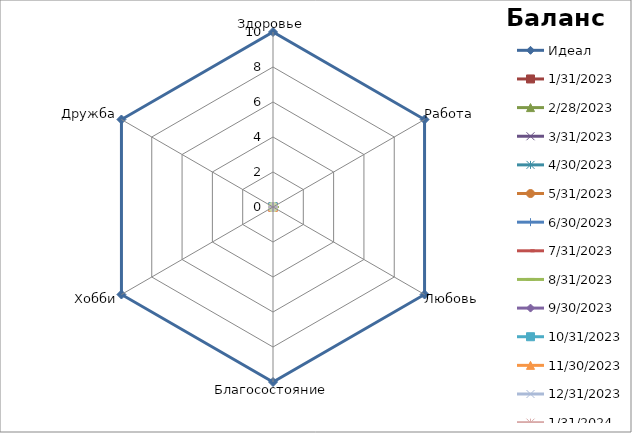
| Category | Идеал | 31.01.2023 | 28.02.2023 | 31.03.2023 | 30.04.2023 | 31.05.2023 | 30.06.2023 | 31.07.2023 | 31.08.2023 | 30.09.2023 | 31.10.2023 | 30.11.2023 | 31.12.2023 | 31.01.2024 | 29.02.2024 | 31.03.2024 |
|---|---|---|---|---|---|---|---|---|---|---|---|---|---|---|---|---|
| Здоровье | 10 | 0 | 0 | 0 | 0 | 0 | 0 | 0 | 0 | 0 | 0 | 0 | 0 | 0 | 0 | 0 |
| Работа | 10 | 0 | 0 | 0 | 0 | 0 | 0 | 0 | 0 | 0 | 0 | 0 | 0 | 0 | 0 | 0 |
| Любовь | 10 | 0 | 0 | 0 | 0 | 0 | 0 | 0 | 0 | 0 | 0 | 0 | 0 | 0 | 0 | 0 |
| Благосостояние | 10 | 0 | 0 | 0 | 0 | 0 | 0 | 0 | 0 | 0 | 0 | 0 | 0 | 0 | 0 | 0 |
| Хобби | 10 | 0 | 0 | 0 | 0 | 0 | 0 | 0 | 0 | 0 | 0 | 0 | 0 | 0 | 0 | 0 |
| Дружба | 10 | 0 | 0 | 0 | 0 | 0 | 0 | 0 | 0 | 0 | 0 | 0 | 0 | 0 | 0 | 0 |